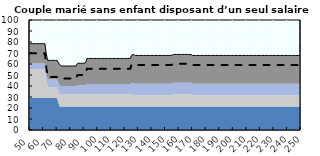
| Category | Coin fiscal marginal (somme des composantes) | Taux d’imposition marginal net |
|---|---|---|
| 50.0 | 78.491 | 69.662 |
| 51.0 | 78.491 | 69.662 |
| 52.0 | 78.491 | 69.662 |
| 53.0 | 78.491 | 69.662 |
| 54.0 | 78.491 | 69.662 |
| 55.0 | 78.491 | 69.662 |
| 56.0 | 78.491 | 69.662 |
| 57.0 | 78.491 | 69.662 |
| 58.0 | 78.491 | 69.662 |
| 59.0 | 78.491 | 69.662 |
| 60.0 | 78.491 | 69.662 |
| 61.0 | 78.491 | 69.662 |
| 62.0 | 69.377 | 56.806 |
| 63.0 | 63.289 | 48.22 |
| 64.0 | 63.289 | 48.22 |
| 65.0 | 63.289 | 48.22 |
| 66.0 | 63.289 | 48.22 |
| 67.0 | 63.289 | 48.22 |
| 68.0 | 63.289 | 48.22 |
| 69.0 | 63.289 | 48.22 |
| 70.0 | 63.289 | 48.22 |
| 71.0 | 61.062 | 48.22 |
| 72.0 | 59.243 | 48.22 |
| 73.0 | 58.224 | 46.925 |
| 74.0 | 58.158 | 46.84 |
| 75.0 | 58.158 | 46.84 |
| 76.0 | 58.158 | 46.84 |
| 77.0 | 58.158 | 46.84 |
| 78.0 | 58.158 | 46.84 |
| 79.0 | 58.158 | 46.84 |
| 80.0 | 58.158 | 46.84 |
| 81.0 | 58.158 | 46.84 |
| 82.0 | 58.158 | 46.84 |
| 83.0 | 58.158 | 46.84 |
| 84.0 | 58.158 | 46.84 |
| 85.0 | 60.482 | 49.794 |
| 86.0 | 60.691 | 50.059 |
| 87.0 | 60.691 | 50.059 |
| 88.0 | 60.691 | 50.059 |
| 89.0 | 60.691 | 50.059 |
| 90.0 | 60.691 | 50.059 |
| 91.0 | 61.2 | 50.706 |
| 92.0 | 65.033 | 55.575 |
| 93.0 | 65.033 | 55.575 |
| 94.0 | 65.033 | 55.575 |
| 95.0 | 65.033 | 55.575 |
| 96.0 | 65.033 | 55.575 |
| 97.0 | 65.033 | 55.575 |
| 98.0 | 65.033 | 55.575 |
| 99.0 | 65.033 | 55.575 |
| 100.0 | 65.033 | 55.575 |
| 101.0 | 65.033 | 55.575 |
| 102.0 | 65.033 | 55.575 |
| 103.0 | 65.033 | 55.575 |
| 104.0 | 65.033 | 55.575 |
| 105.0 | 65.033 | 55.575 |
| 106.0 | 65.033 | 55.575 |
| 107.0 | 65.033 | 55.575 |
| 108.0 | 65.033 | 55.575 |
| 109.0 | 65.033 | 55.575 |
| 110.0 | 65.033 | 55.575 |
| 111.0 | 65.033 | 55.575 |
| 112.0 | 65.033 | 55.575 |
| 113.0 | 65.033 | 55.575 |
| 114.0 | 65.033 | 55.575 |
| 115.0 | 65.033 | 55.575 |
| 116.0 | 65.033 | 55.575 |
| 117.0 | 65.033 | 55.575 |
| 118.0 | 65.033 | 55.575 |
| 119.0 | 65.033 | 55.575 |
| 120.0 | 65.033 | 55.575 |
| 121.0 | 65.033 | 55.575 |
| 122.0 | 65.033 | 55.575 |
| 123.0 | 65.033 | 55.575 |
| 124.0 | 65.033 | 55.575 |
| 125.0 | 68.026 | 59.378 |
| 126.0 | 68.651 | 60.172 |
| 127.0 | 68.159 | 59.547 |
| 128.0 | 67.762 | 59.042 |
| 129.0 | 67.762 | 59.042 |
| 130.0 | 67.762 | 59.042 |
| 131.0 | 67.762 | 59.042 |
| 132.0 | 67.762 | 59.042 |
| 133.0 | 67.762 | 59.042 |
| 134.0 | 67.762 | 59.042 |
| 135.0 | 67.762 | 59.042 |
| 136.0 | 67.762 | 59.042 |
| 137.0 | 67.762 | 59.042 |
| 138.0 | 67.762 | 59.042 |
| 139.0 | 67.762 | 59.042 |
| 140.0 | 67.762 | 59.042 |
| 141.0 | 67.762 | 59.042 |
| 142.0 | 67.762 | 59.042 |
| 143.0 | 67.762 | 59.042 |
| 144.0 | 67.762 | 59.042 |
| 145.0 | 67.762 | 59.042 |
| 146.0 | 67.762 | 59.042 |
| 147.0 | 67.762 | 59.042 |
| 148.0 | 67.762 | 59.042 |
| 149.0 | 67.762 | 59.042 |
| 150.0 | 67.762 | 59.042 |
| 151.0 | 67.762 | 59.042 |
| 152.0 | 67.762 | 59.042 |
| 153.0 | 67.762 | 59.042 |
| 154.0 | 67.762 | 59.042 |
| 155.0 | 68.104 | 59.477 |
| 156.0 | 68.695 | 60.227 |
| 157.0 | 68.695 | 60.227 |
| 158.0 | 68.695 | 60.227 |
| 159.0 | 68.695 | 60.227 |
| 160.0 | 68.695 | 60.227 |
| 161.0 | 68.695 | 60.227 |
| 162.0 | 68.695 | 60.227 |
| 163.0 | 68.695 | 60.227 |
| 164.0 | 68.695 | 60.227 |
| 165.0 | 68.695 | 60.227 |
| 166.0 | 68.695 | 60.227 |
| 167.0 | 68.695 | 60.227 |
| 168.0 | 68.695 | 60.227 |
| 169.0 | 68.516 | 60.001 |
| 170.0 | 67.762 | 59.042 |
| 171.0 | 67.762 | 59.042 |
| 172.0 | 67.762 | 59.042 |
| 173.0 | 67.762 | 59.042 |
| 174.0 | 67.762 | 59.042 |
| 175.0 | 67.762 | 59.042 |
| 176.0 | 67.762 | 59.042 |
| 177.0 | 67.762 | 59.042 |
| 178.0 | 67.762 | 59.042 |
| 179.0 | 67.762 | 59.042 |
| 180.0 | 67.762 | 59.042 |
| 181.0 | 67.762 | 59.042 |
| 182.0 | 67.762 | 59.042 |
| 183.0 | 67.762 | 59.042 |
| 184.0 | 67.762 | 59.042 |
| 185.0 | 67.762 | 59.042 |
| 186.0 | 67.762 | 59.042 |
| 187.0 | 67.762 | 59.042 |
| 188.0 | 67.762 | 59.042 |
| 189.0 | 67.762 | 59.042 |
| 190.0 | 67.762 | 59.042 |
| 191.0 | 67.762 | 59.042 |
| 192.0 | 67.762 | 59.042 |
| 193.0 | 67.762 | 59.042 |
| 194.0 | 67.762 | 59.042 |
| 195.0 | 67.762 | 59.042 |
| 196.0 | 67.762 | 59.042 |
| 197.0 | 67.762 | 59.042 |
| 198.0 | 67.762 | 59.042 |
| 199.0 | 67.762 | 59.042 |
| 200.0 | 67.762 | 59.042 |
| 201.0 | 67.762 | 59.042 |
| 202.0 | 67.762 | 59.042 |
| 203.0 | 67.762 | 59.042 |
| 204.0 | 67.762 | 59.042 |
| 205.0 | 67.762 | 59.042 |
| 206.0 | 67.762 | 59.042 |
| 207.0 | 67.762 | 59.042 |
| 208.0 | 67.762 | 59.042 |
| 209.0 | 67.762 | 59.042 |
| 210.0 | 67.762 | 59.042 |
| 211.0 | 67.762 | 59.042 |
| 212.0 | 67.762 | 59.042 |
| 213.0 | 67.762 | 59.042 |
| 214.0 | 67.762 | 59.042 |
| 215.0 | 67.762 | 59.042 |
| 216.0 | 67.762 | 59.042 |
| 217.0 | 67.762 | 59.042 |
| 218.0 | 67.762 | 59.042 |
| 219.0 | 67.762 | 59.042 |
| 220.0 | 67.762 | 59.042 |
| 221.0 | 67.762 | 59.042 |
| 222.0 | 67.762 | 59.042 |
| 223.0 | 67.762 | 59.042 |
| 224.0 | 67.762 | 59.042 |
| 225.0 | 67.762 | 59.042 |
| 226.0 | 67.762 | 59.042 |
| 227.0 | 67.762 | 59.042 |
| 228.0 | 67.762 | 59.042 |
| 229.0 | 67.762 | 59.042 |
| 230.0 | 67.762 | 59.042 |
| 231.0 | 67.762 | 59.042 |
| 232.0 | 67.762 | 59.042 |
| 233.0 | 67.762 | 59.042 |
| 234.0 | 67.762 | 59.042 |
| 235.0 | 67.762 | 59.042 |
| 236.0 | 67.762 | 59.042 |
| 237.0 | 67.762 | 59.042 |
| 238.0 | 67.762 | 59.042 |
| 239.0 | 67.762 | 59.042 |
| 240.0 | 67.762 | 59.042 |
| 241.0 | 67.762 | 59.042 |
| 242.0 | 67.762 | 59.042 |
| 243.0 | 67.762 | 59.042 |
| 244.0 | 67.762 | 59.042 |
| 245.0 | 67.762 | 59.042 |
| 246.0 | 67.762 | 59.042 |
| 247.0 | 67.762 | 59.042 |
| 248.0 | 67.762 | 59.042 |
| 249.0 | 67.762 | 59.042 |
| 250.0 | 67.762 | 59.042 |